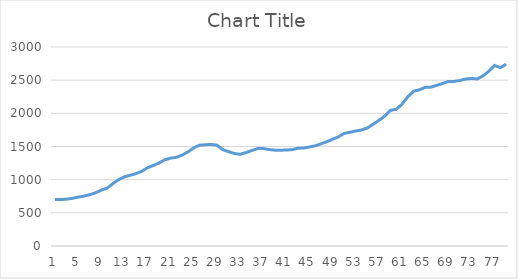
| Category | Series 0 |
|---|---|
| 0 | 701 |
| 1 | 700 |
| 2 | 706 |
| 3 | 718 |
| 4 | 737 |
| 5 | 752 |
| 6 | 773 |
| 7 | 801 |
| 8 | 842 |
| 9 | 871 |
| 10 | 938 |
| 11 | 1000 |
| 12 | 1041 |
| 13 | 1066 |
| 14 | 1091 |
| 15 | 1125 |
| 16 | 1180 |
| 17 | 1214 |
| 18 | 1251 |
| 19 | 1300 |
| 20 | 1324 |
| 21 | 1337 |
| 22 | 1370 |
| 23 | 1418 |
| 24 | 1479 |
| 25 | 1520 |
| 26 | 1526 |
| 27 | 1531 |
| 28 | 1521 |
| 29 | 1453 |
| 30 | 1423 |
| 31 | 1395 |
| 32 | 1383 |
| 33 | 1407 |
| 34 | 1438 |
| 35 | 1468 |
| 36 | 1469 |
| 37 | 1455 |
| 38 | 1445 |
| 39 | 1444 |
| 40 | 1447 |
| 41 | 1452 |
| 42 | 1474 |
| 43 | 1477 |
| 44 | 1493 |
| 45 | 1510 |
| 46 | 1541 |
| 47 | 1572 |
| 48 | 1609 |
| 49 | 1645 |
| 50 | 1697 |
| 51 | 1715 |
| 52 | 1734 |
| 53 | 1749 |
| 54 | 1778 |
| 55 | 1835 |
| 56 | 1892 |
| 57 | 1956 |
| 58 | 2045 |
| 59 | 2060 |
| 60 | 2136 |
| 61 | 2249 |
| 62 | 2333 |
| 63 | 2355 |
| 64 | 2391 |
| 65 | 2395 |
| 66 | 2422 |
| 67 | 2449 |
| 68 | 2481 |
| 69 | 2481 |
| 70 | 2495 |
| 71 | 2517 |
| 72 | 2526 |
| 73 | 2518 |
| 74 | 2565 |
| 75 | 2633 |
| 76 | 2722 |
| 77 | 2689 |
| 78 | 2740 |